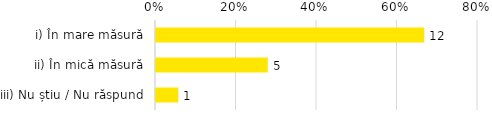
| Category | Total |
|---|---|
| i) În mare măsură | 0.667 |
| ii) În mică măsură | 0.278 |
| iii) Nu știu / Nu răspund | 0.056 |